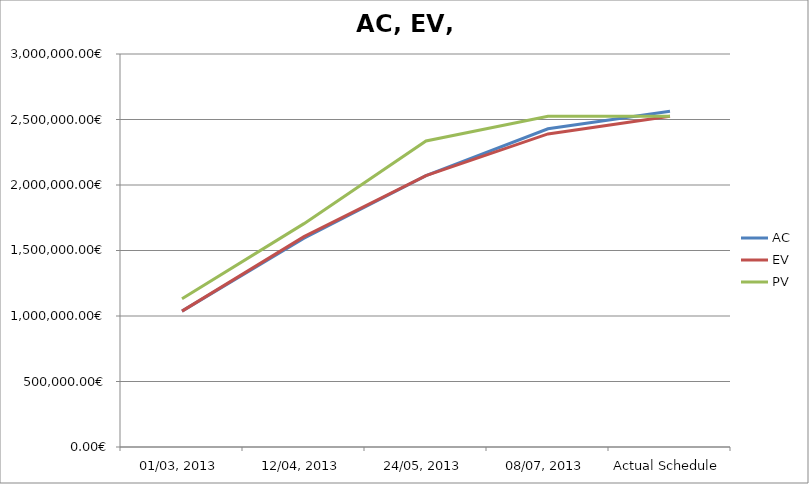
| Category | AC | EV | PV |
|---|---|---|---|
| 01/03, 2013 | 1037105.193 | 1037105.194 | 1131434.795 |
| 12/04, 2013 | 1593639.654 | 1605920.394 | 1705011.19 |
| 24/05, 2013 | 2070923.066 | 2071298.352 | 2335722.387 |
| 08/07, 2013 | 2428840.748 | 2389930.071 | 2524765.186 |
| Actual Schedule | 2563675.864 | 2524765.186 | 2524765.186 |